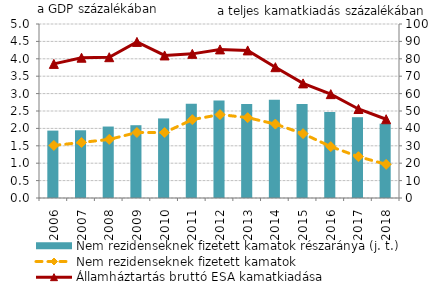
| Category | Nem rezidenseknek fizetett kamatok részaránya (j. t.) |
|---|---|
| 2006.0 | 38.734 |
| 2007.0 | 38.919 |
| 2008.0 | 41.069 |
| 2009.0 | 41.833 |
| 2010.0 | 45.737 |
| 2011.0 | 54.17 |
| 2012.0 | 56.012 |
| 2013.0 | 54.062 |
| 2014.0 | 56.448 |
| 2015.0 | 53.997 |
| 2016.0 | 49.469 |
| 2017.0 | 46.439 |
| 2018.0 | 42.709 |